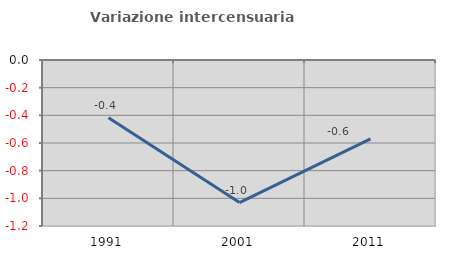
| Category | Variazione intercensuaria annua |
|---|---|
| 1991.0 | -0.418 |
| 2001.0 | -1.031 |
| 2011.0 | -0.57 |